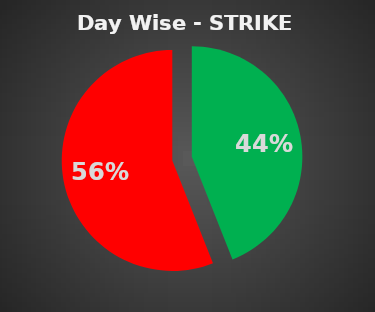
| Category | Series 0 |
|---|---|
| 0 | 0.44 |
| 1 | 0.56 |